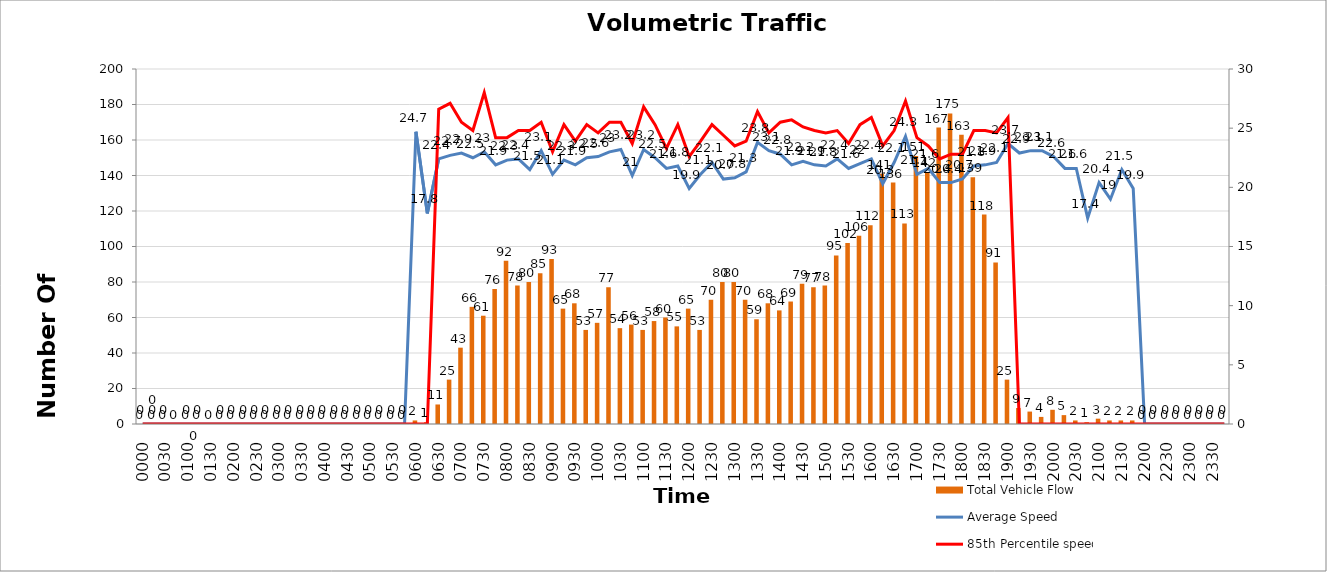
| Category | Total Vehicle Flow |
|---|---|
| 0000 | 0 |
| 0015 | 0 |
| 0030 | 0 |
| 0045 | 0 |
| 0100 | 0 |
| 0115 | 0 |
| 0130 | 0 |
| 0145 | 0 |
| 0200 | 0 |
| 0215 | 0 |
| 0230 | 0 |
| 0245 | 0 |
| 0300 | 0 |
| 0315 | 0 |
| 0330 | 0 |
| 0345 | 0 |
| 0400 | 0 |
| 0415 | 0 |
| 0430 | 0 |
| 0445 | 0 |
| 0500 | 0 |
| 0515 | 0 |
| 0530 | 0 |
| 0545 | 0 |
| 0600 | 2 |
| 0615 | 1 |
| 0630 | 11 |
| 0645 | 25 |
| 0700 | 43 |
| 0715 | 66 |
| 0730 | 61 |
| 0745 | 76 |
| 0800 | 92 |
| 0815 | 78 |
| 0830 | 80 |
| 0845 | 85 |
| 0900 | 93 |
| 0915 | 65 |
| 0930 | 68 |
| 0945 | 53 |
| 1000 | 57 |
| 1015 | 77 |
| 1030 | 54 |
| 1045 | 56 |
| 1100 | 53 |
| 1115 | 58 |
| 1130 | 60 |
| 1145 | 55 |
| 1200 | 65 |
| 1215 | 53 |
| 1230 | 70 |
| 1245 | 80 |
| 1300 | 80 |
| 1315 | 70 |
| 1330 | 59 |
| 1345 | 68 |
| 1400 | 64 |
| 1415 | 69 |
| 1430 | 79 |
| 1445 | 77 |
| 1500 | 78 |
| 1515 | 95 |
| 1530 | 102 |
| 1545 | 106 |
| 1600 | 112 |
| 1615 | 141 |
| 1630 | 136 |
| 1645 | 113 |
| 1700 | 151 |
| 1715 | 142 |
| 1730 | 167 |
| 1745 | 175 |
| 1800 | 163 |
| 1815 | 139 |
| 1830 | 118 |
| 1845 | 91 |
| 1900 | 25 |
| 1915 | 9 |
| 1930 | 7 |
| 1945 | 4 |
| 2000 | 8 |
| 2015 | 5 |
| 2030 | 2 |
| 2045 | 1 |
| 2100 | 3 |
| 2115 | 2 |
| 2130 | 2 |
| 2145 | 2 |
| 2200 | 0 |
| 2215 | 0 |
| 2230 | 0 |
| 2245 | 0 |
| 2300 | 0 |
| 2315 | 0 |
| 2330 | 0 |
| 2345 | 0 |